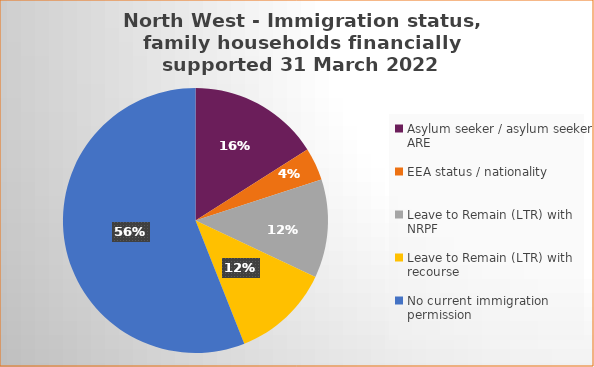
| Category | Number  | Percentage |
|---|---|---|
| Asylum seeker / asylum seeker ARE | 4 | 0.16 |
| EEA status / nationality  | 1 | 0.04 |
| Leave to Remain (LTR) with NRPF | 3 | 0.12 |
| Leave to Remain (LTR) with recourse | 3 | 0.12 |
| No current immigration permission | 14 | 0.56 |